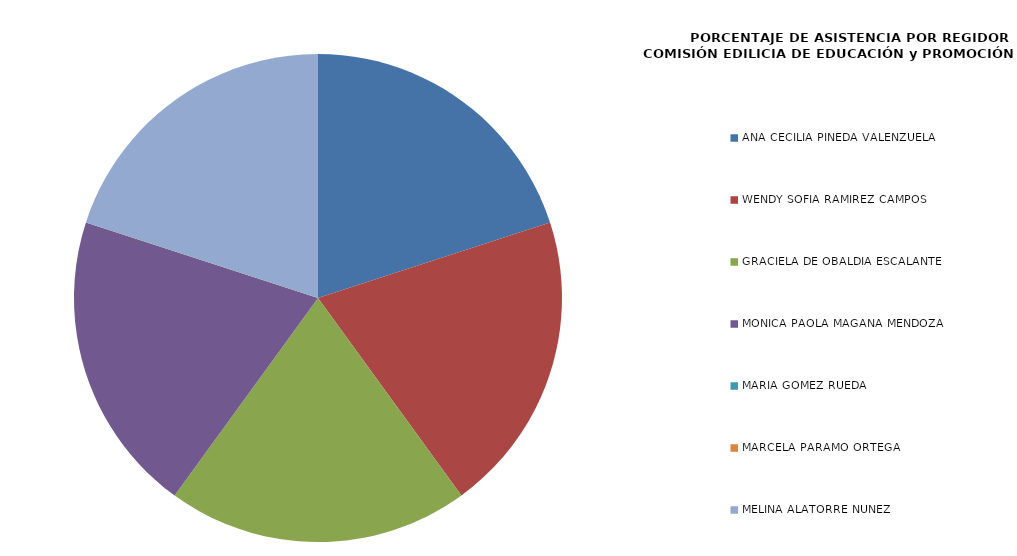
| Category | Series 0 |
|---|---|
| ANA CECILIA PINEDA VALENZUELA | 100 |
| WENDY SOFÍA RAMÍREZ CAMPOS | 100 |
| GRACIELA DE OBALDÍA ESCALANTE | 100 |
| MÓNICA PAOLA MAGAÑA MENDOZA | 100 |
| MARÍA GÓMEZ RUEDA | 0 |
| MARCELA PÁRAMO ORTEGA | 0 |
| MELINA ALATORRE NÚÑEZ | 100 |